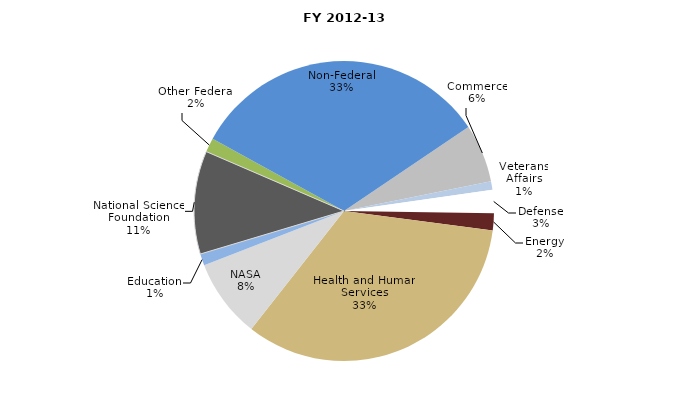
| Category | Series 0 |
|---|---|
| Commerce | 48253031 |
| Veterans Affairs | 7019468 |
| Defense | 19414390 |
| Energy | 14157679 |
| Health and Human Services | 258255381.05 |
| NASA | 65628972 |
| Education | 9636157 |
| National Science Foundation | 85596283 |
| Other Federal | 11817745 |
| Non-Federal | 250753187.82 |